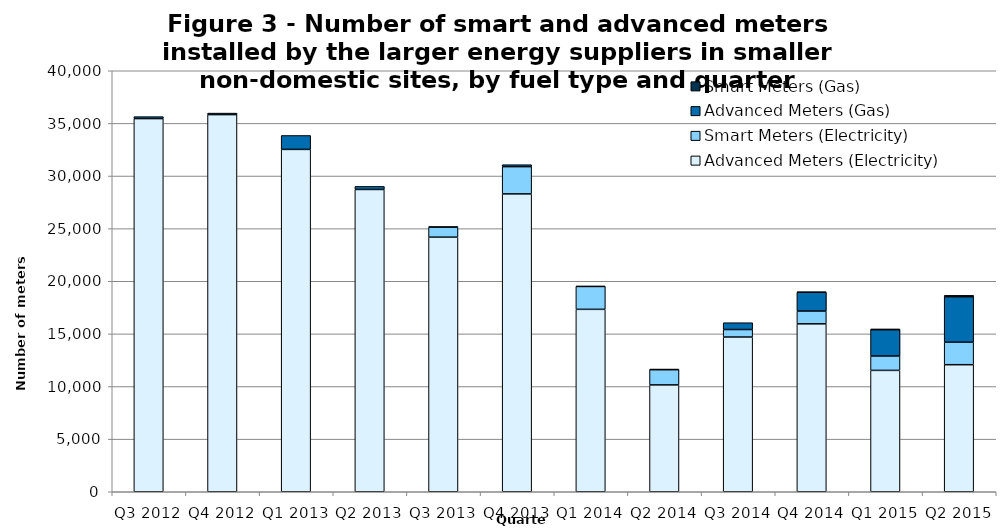
| Category | Advanced Meters (Electricity)  | Smart Meters (Electricity) | Advanced Meters (Gas) | Smart Meters (Gas) |
|---|---|---|---|---|
| Q3 2012 | 35455 | 0 | 186 | 0 |
| Q4 2012 | 35834 | 0 | 144 | 0 |
| Q1 2013 | 32529 | 0 | 1321 | 0 |
| Q2 2013 | 28722 | 0 | 290 | 0 |
| Q3 2013 | 24189 | 946 | 60 | 0 |
| Q4 2013 | 28300 | 2590 | 184 | 0 |
| Q1 2014 | 17332 | 2175 | 24 | 0 |
| Q2 2014 | 10152 | 1445 | 59 | 0 |
| Q3 2014 | 14700 | 714 | 647 | 0 |
| Q4 2014 | 15955 | 1214 | 1786 | 30 |
| Q1 2015 | 11531 | 1369 | 2497 | 72 |
| Q2 2015 | 12072 | 2137 | 4323 | 129 |